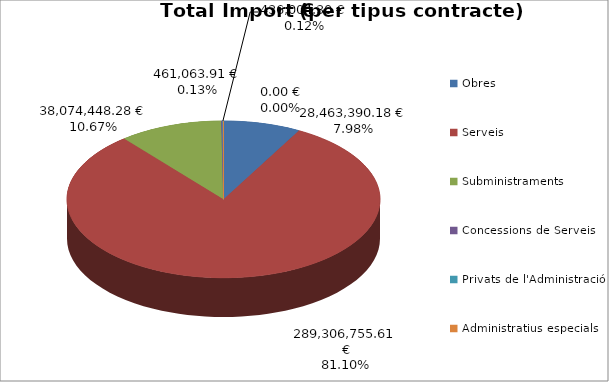
| Category | Total preu              (amb iva) |
|---|---|
| Obres | 28463390.18 |
| Serveis | 289306755.61 |
| Subministraments | 38074448.28 |
| Concessions de Serveis | 461063.91 |
| Privats de l'Administració | 436004.3 |
| Administratius especials | 0 |